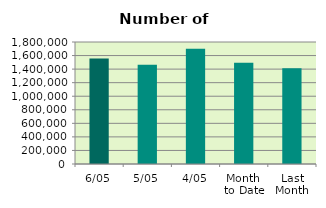
| Category | Series 0 |
|---|---|
| 6/05 | 1554850 |
| 5/05 | 1464956 |
| 4/05 | 1699326 |
| Month 
to Date | 1493522 |
| Last
Month | 1414476.2 |